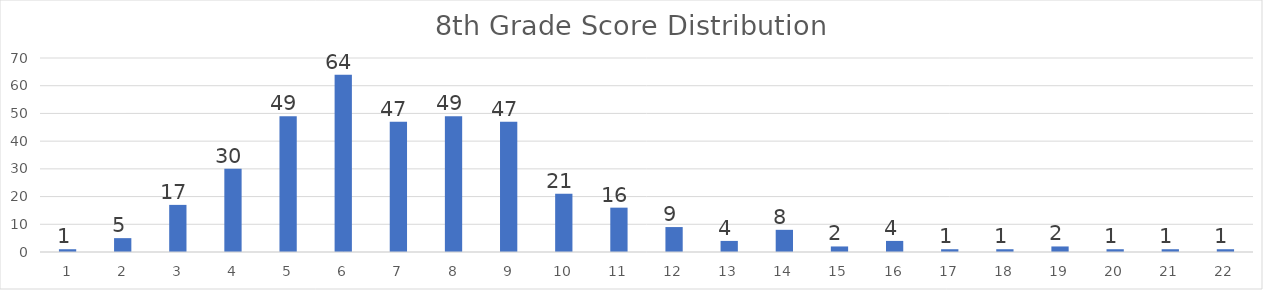
| Category | Series 0 |
|---|---|
| 0 | 1 |
| 1 | 5 |
| 2 | 17 |
| 3 | 30 |
| 4 | 49 |
| 5 | 64 |
| 6 | 47 |
| 7 | 49 |
| 8 | 47 |
| 9 | 21 |
| 10 | 16 |
| 11 | 9 |
| 12 | 4 |
| 13 | 8 |
| 14 | 2 |
| 15 | 4 |
| 16 | 1 |
| 17 | 1 |
| 18 | 2 |
| 19 | 1 |
| 20 | 1 |
| 21 | 1 |